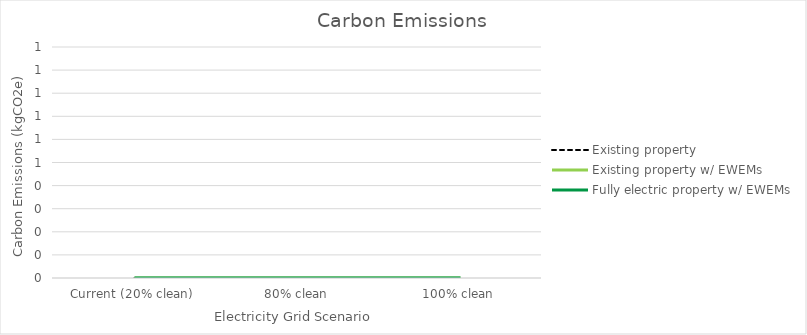
| Category | Existing property | Existing property w/ EWEMs | Fully electric property w/ EWEMs |
|---|---|---|---|
| Current (20% clean) | 0 | 0 | 0 |
| 80% clean | 0 | 0 | 0 |
| 100% clean | 0 | 0 | 0 |